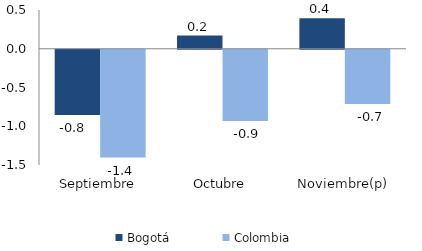
| Category | Bogotá | Colombia |
|---|---|---|
| Septiembre | -0.842 | -1.391 |
| Octubre | 0.169 | -0.921 |
| Noviembre(p) | 0.394 | -0.701 |